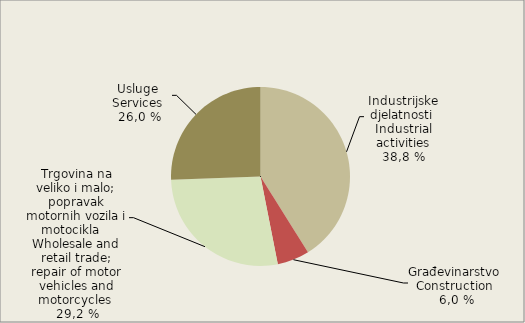
| Category | Dodana vrijednost po faktorskim troškovima
Value added at factor cost |
|---|---|
| Industrijske djelatnosti (B, C, D i E)
Industrial activities (B, C, D and E) | 41.1 |
| Građevinarstvo (F)
Construction (F) | 5.8 |
| Trgovina na veliko i malo; popravak motornih vozila i motocikla  (G) 
Wholesale and retail trade; repair of motor vehicles and motorcycles  (G)
 | 27.5 |
| Usluge (H, I i L)
Services (H, I and L) | 25.6 |